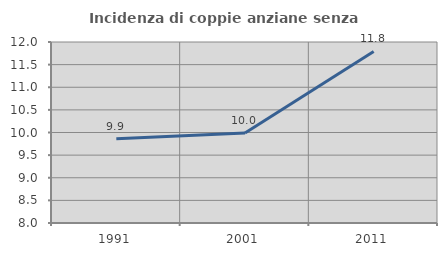
| Category | Incidenza di coppie anziane senza figli  |
|---|---|
| 1991.0 | 9.864 |
| 2001.0 | 9.991 |
| 2011.0 | 11.79 |